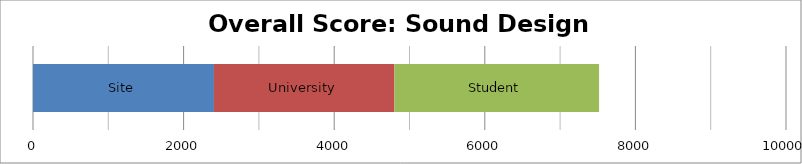
| Category | Site | University | Student |
|---|---|---|---|
| 0 | 2403.125 | 2396.25 | 2718.125 |